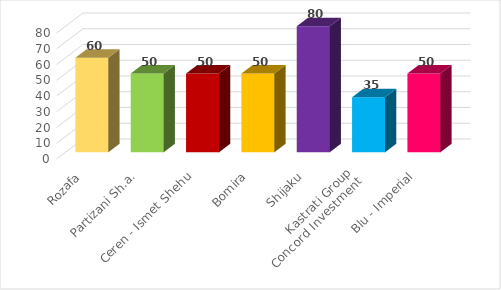
| Category | Të punësuar nga Investimi |
|---|---|
| Rozafa | 60 |
| Partizani Sh.a. | 50 |
| Ceren - Ismet Shehu | 50 |
| Bomira | 50 |
| Shijaku | 80 |
| Kastrati Group
Concord Investment | 35 |
| Blu - Imperial | 50 |